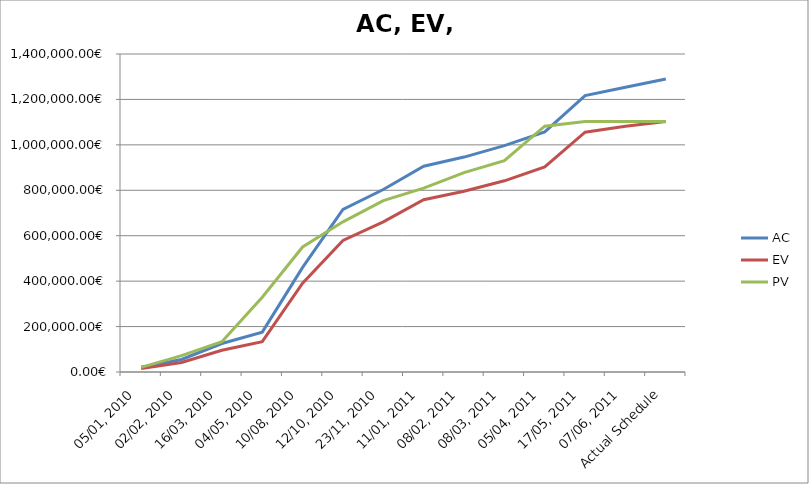
| Category | AC | EV | PV |
|---|---|---|---|
| 05/01, 2010 | 20618.62 | 14905.934 | 20618.62 |
| 02/02, 2010 | 54994.689 | 42003.622 | 71942.288 |
| 16/03, 2010 | 125464.086 | 95714.387 | 133289.686 |
| 04/05, 2010 | 175564.484 | 133289.686 | 329182.336 |
| 10/08, 2010 | 460443.135 | 391006.334 | 550456.498 |
| 12/10, 2010 | 715526.737 | 579496.338 | 661131.348 |
| 23/11, 2010 | 803302.147 | 661131.348 | 754228.59 |
| 11/01, 2011 | 905782.989 | 758726.916 | 809456.9 |
| 08/02, 2011 | 946184.899 | 795979.4 | 877502.652 |
| 08/03, 2011 | 996476.649 | 841778.65 | 930133.611 |
| 05/04, 2011 | 1057200.411 | 902502.412 | 1082351.783 |
| 17/05, 2011 | 1216651.382 | 1055844.104 | 1102536.784 |
| 07/06, 2011 | 1253480.582 | 1082351.783 | 1102536.784 |
| Actual Schedule | 1289696.783 | 1102536.784 | 1102536.784 |